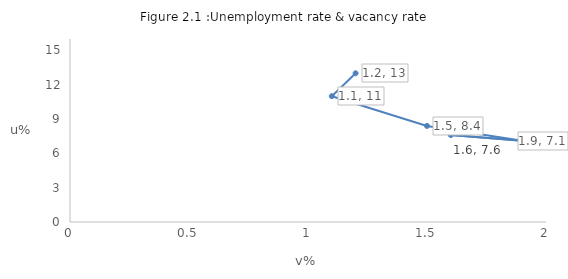
| Category | Unemployment rate (Eurostat) |
|---|---|
| 1.2 | 13 |
| 1.1 | 11 |
| 1.5 | 8.4 |
| 1.9 | 7.1 |
| 1.6 | 7.6 |